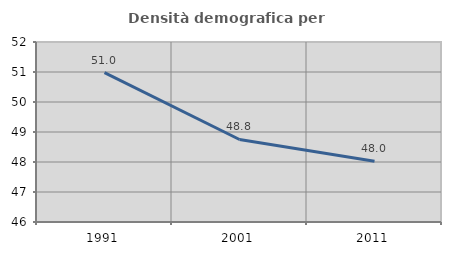
| Category | Densità demografica |
|---|---|
| 1991.0 | 50.982 |
| 2001.0 | 48.75 |
| 2011.0 | 48.022 |